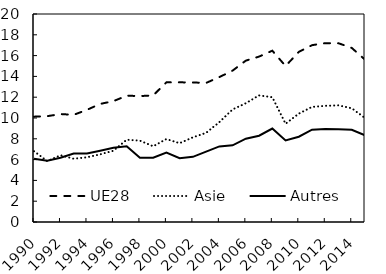
| Category | UE28 | Asie | Autres |
|---|---|---|---|
| 1990.0 | 10.13 | 6.81 | 6.08 |
| 1991.0 | 10.175 | 5.85 | 5.884 |
| 1992.0 | 10.379 | 6.42 | 6.171 |
| 1993.0 | 10.306 | 6.081 | 6.583 |
| 1994.0 | 10.785 | 6.222 | 6.586 |
| 1995.0 | 11.354 | 6.506 | 6.859 |
| 1996.0 | 11.622 | 6.852 | 7.136 |
| 1997.0 | 12.144 | 7.911 | 7.276 |
| 1998.0 | 12.109 | 7.824 | 6.172 |
| 1999.0 | 12.167 | 7.279 | 6.188 |
| 2000.0 | 13.429 | 7.975 | 6.665 |
| 2001.0 | 13.429 | 7.578 | 6.134 |
| 2002.0 | 13.416 | 8.139 | 6.263 |
| 2003.0 | 13.373 | 8.574 | 6.769 |
| 2004.0 | 13.935 | 9.602 | 7.27 |
| 2005.0 | 14.554 | 10.823 | 7.37 |
| 2006.0 | 15.516 | 11.421 | 8.012 |
| 2007.0 | 15.905 | 12.174 | 8.296 |
| 2008.0 | 16.47 | 11.995 | 8.99 |
| 2009.0 | 14.996 | 9.446 | 7.843 |
| 2010.0 | 16.355 | 10.416 | 8.199 |
| 2011.0 | 17.003 | 11.065 | 8.873 |
| 2012.0 | 17.198 | 11.171 | 8.95 |
| 2013.0 | 17.187 | 11.218 | 8.911 |
| 2014.0 | 16.739 | 10.933 | 8.874 |
| 2015.0 | 15.609 | 9.998 | 8.338 |